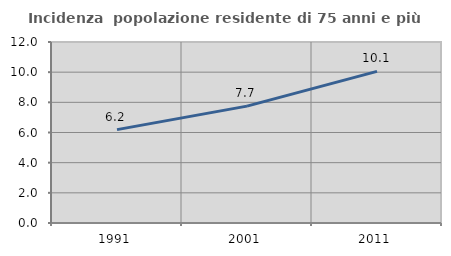
| Category | Incidenza  popolazione residente di 75 anni e più |
|---|---|
| 1991.0 | 6.191 |
| 2001.0 | 7.747 |
| 2011.0 | 10.052 |